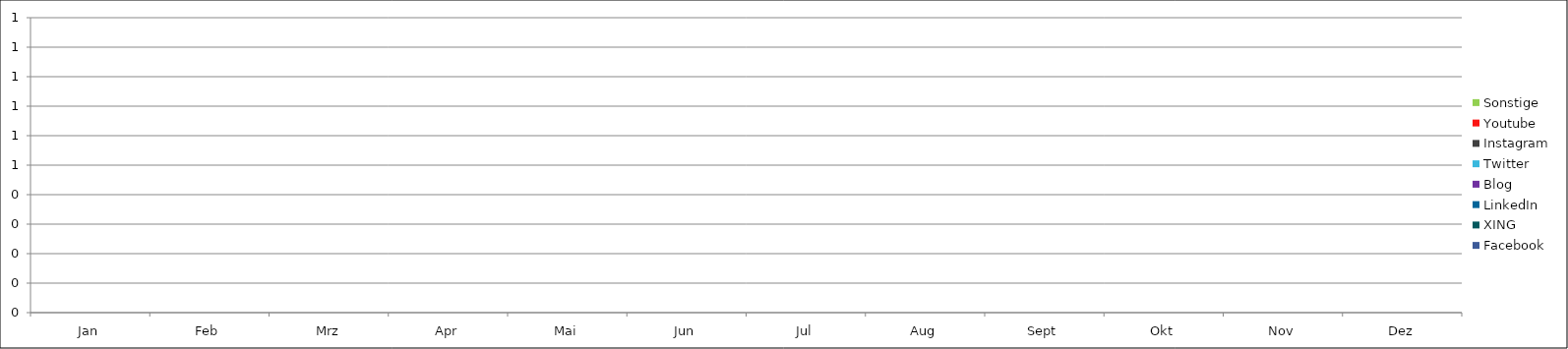
| Category | Facebook | XING | LinkedIn | Blog | Twitter | Instagram | Youtube | Sonstige |
|---|---|---|---|---|---|---|---|---|
| Jan | 0 | 0 | 0 | 0 | 0 | 0 | 0 | 0 |
| Feb | 0 | 0 | 0 | 0 | 0 | 0 | 0 | 0 |
| Mrz | 0 | 0 | 0 | 0 | 0 | 0 | 0 | 0 |
| Apr | 0 | 0 | 0 | 0 | 0 | 0 | 0 | 0 |
| Mai | 0 | 0 | 0 | 0 | 0 | 0 | 0 | 0 |
| Jun | 0 | 0 | 0 | 0 | 0 | 0 | 0 | 0 |
| Jul | 0 | 0 | 0 | 0 | 0 | 0 | 0 | 0 |
| Aug | 0 | 0 | 0 | 0 | 0 | 0 | 0 | 0 |
| Sept | 0 | 0 | 0 | 0 | 0 | 0 | 0 | 0 |
| Okt | 0 | 0 | 0 | 0 | 0 | 0 | 0 | 0 |
| Nov | 0 | 0 | 0 | 0 | 0 | 0 | 0 | 0 |
| Dez | 0 | 0 | 0 | 0 | 0 | 0 | 0 | 0 |